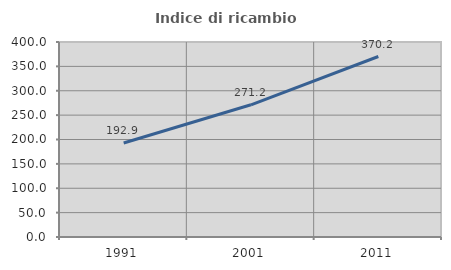
| Category | Indice di ricambio occupazionale  |
|---|---|
| 1991.0 | 192.925 |
| 2001.0 | 271.186 |
| 2011.0 | 370.225 |